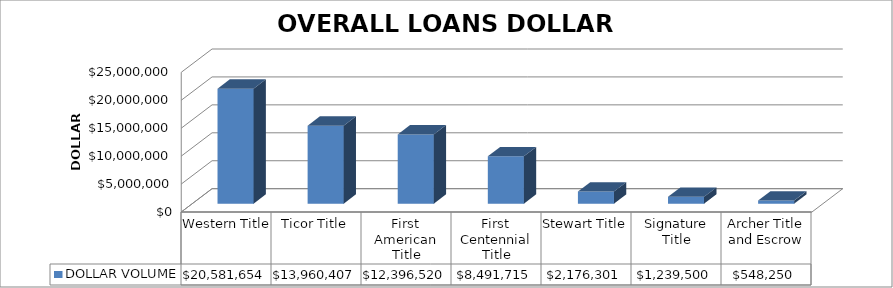
| Category | DOLLAR VOLUME |
|---|---|
| Western Title | 20581654 |
| Ticor Title | 13960407 |
| First American Title | 12396520 |
| First Centennial Title | 8491715 |
| Stewart Title | 2176301 |
| Signature Title | 1239500 |
| Archer Title and Escrow | 548250 |